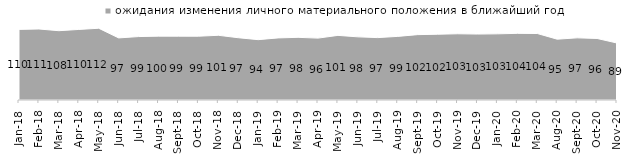
| Category | ожидания изменения личного материального положения в ближайший год |
|---|---|
| 2018-01-01 | 110.05 |
| 2018-02-01 | 110.65 |
| 2018-03-01 | 108 |
| 2018-04-01 | 109.95 |
| 2018-05-01 | 111.8 |
| 2018-06-01 | 96.75 |
| 2018-07-01 | 98.85 |
| 2018-08-01 | 99.5 |
| 2018-09-01 | 99.45 |
| 2018-10-01 | 99.4 |
| 2018-11-01 | 100.848 |
| 2018-12-01 | 97.05 |
| 2019-01-01 | 94.05 |
| 2019-02-01 | 96.75 |
| 2019-03-01 | 97.663 |
| 2019-04-01 | 96.436 |
| 2019-05-01 | 100.693 |
| 2019-06-01 | 98.404 |
| 2019-07-01 | 97.228 |
| 2019-08-01 | 99.151 |
| 2019-09-01 | 101.881 |
| 2019-10-01 | 102.475 |
| 2019-11-01 | 103.218 |
| 2019-12-01 | 102.772 |
| 2020-01-01 | 103.119 |
| 2020-02-01 | 103.861 |
| 2020-03-01 | 103.619 |
| 2020-08-01 | 94.786 |
| 2020-09-01 | 96.864 |
| 2020-10-01 | 95.914 |
| 2020-11-01 | 88.8 |